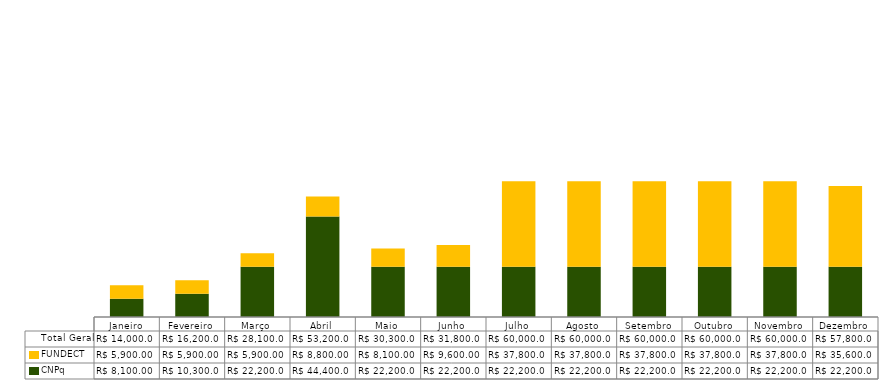
| Category | CNPq | FUNDECT | Total Geral |
|---|---|---|---|
| Janeiro | 8100 | 5900 | 14000 |
| Fevereiro | 10300 | 5900 | 16200 |
| Março | 22200 | 5900 | 28100 |
| Abril | 44400 | 8800 | 53200 |
| Maio | 22200 | 8100 | 30300 |
| Junho | 22200 | 9600 | 31800 |
| Julho | 22200 | 37800 | 60000 |
| Agosto | 22200 | 37800 | 60000 |
| Setembro | 22200 | 37800 | 60000 |
| Outubro | 22200 | 37800 | 60000 |
| Novembro | 22200 | 37800 | 60000 |
| Dezembro | 22200 | 35600 | 57800 |